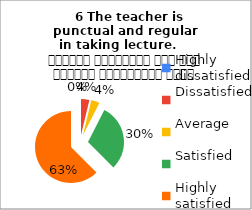
| Category |    6 The teacher is 
punctual and regular  in taking lecture.     शिक्षक समयनिष्ठ हैं एवं नियमित व्याख्यान देते हैं |
|---|---|
| Highly dissatisfied | 0 |
| Dissatisfied | 3 |
| Average | 3 |
| Satisfied | 24 |
| Highly satisfied | 50 |